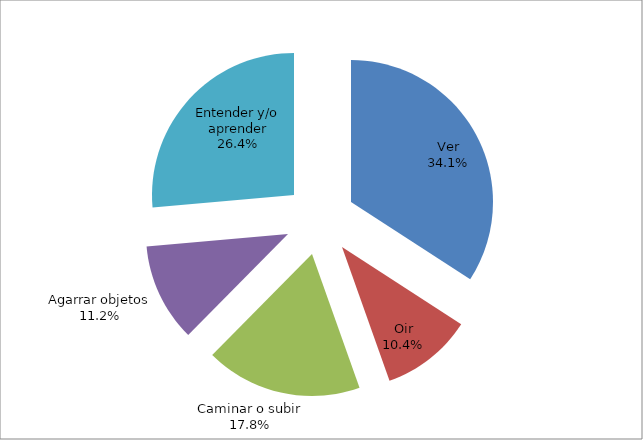
| Category | Series 0 |
|---|---|
| Ver | 34.146 |
| Oir | 10.424 |
| Caminar o subir | 17.833 |
| Agarrar objetos | 11.186 |
| Entender y/o aprender | 26.412 |